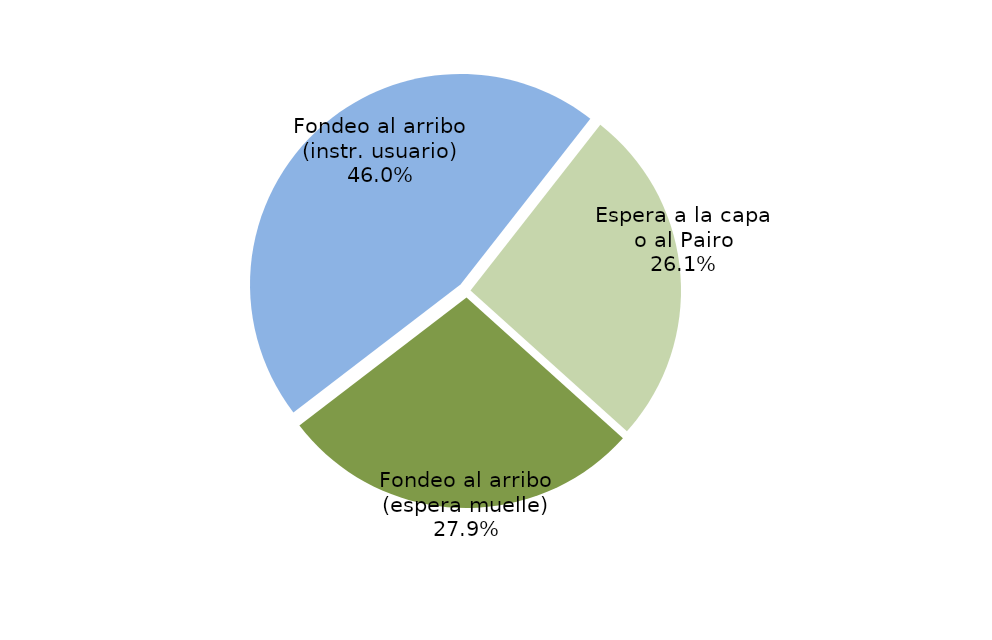
| Category | Series 0 |
|---|---|
| Fondeo al arribo (espera muelle) | 4893.443 |
| Fondeo al arribo (instr. usuario) | 8055.967 |
| Espera a la capa o al Pairo | 4571.35 |